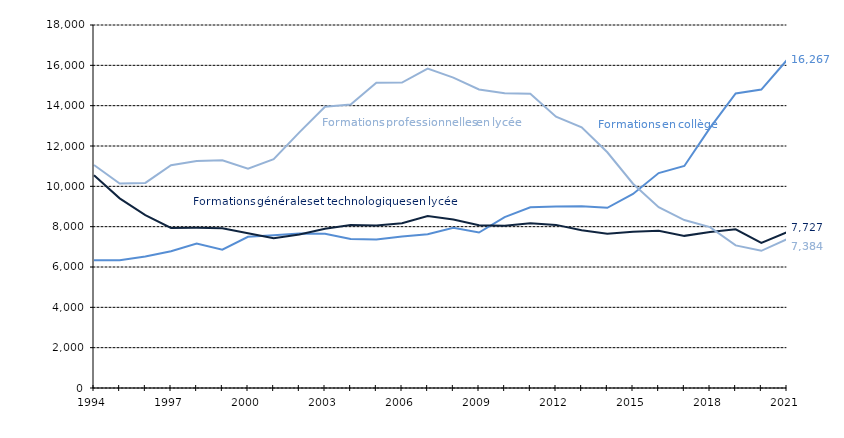
| Category | 1ER CYCLE | 2ND CYCLE G&T | 2ND CYCLE PRO |
|---|---|---|---|
| 1994.0 | 6330 | 10552 | 11056 |
| 1995.0 | 6332 | 9405 | 10139 |
| 1996.0 | 6519 | 8577 | 10169 |
| 1997.0 | 6778 | 7936 | 11051 |
| 1998.0 | 7159 | 7941 | 11253 |
| 1999.0 | 6860 | 7924 | 11293 |
| 2000.0 | 7497 | 7677 | 10872 |
| 2001.0 | 7570 | 7427 | 11346 |
| 2002.0 | 7659 | 7616 | 12675 |
| 2003.0 | 7653 | 7899 | 13948 |
| 2004.0 | 7386 | 8084 | 14055 |
| 2005.0 | 7365 | 8059 | 15140 |
| 2006.0 | 7513 | 8169 | 15148 |
| 2007.0 | 7628 | 8527 | 15836 |
| 2008.0 | 7945 | 8360 | 15391 |
| 2009.0 | 7711 | 8071 | 14801 |
| 2010.0 | 8476 | 8043 | 14616 |
| 2011.0 | 8963 | 8173 | 14595 |
| 2012.0 | 9001 | 8088 | 13456 |
| 2013.0 | 9018 | 7826 | 12928 |
| 2014.0 | 8934 | 7654 | 11689 |
| 2015.0 | 9621 | 7752 | 10129 |
| 2016.0 | 10657 | 7795 | 8968 |
| 2017.0 | 11008 | 7544 | 8327 |
| 2018.0 | 12898 | 7737 | 7976 |
| 2019.0 | 14606 | 7870 | 7071 |
| 2020.0 | 14796 | 7195 | 6803 |
| 2021.0 | 16267 | 7727 | 7384 |